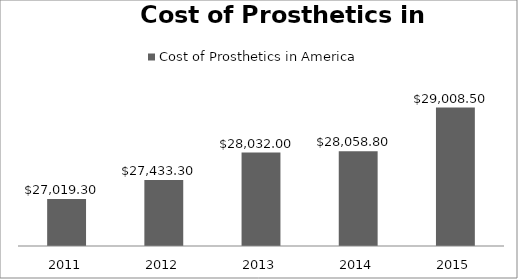
| Category | Cost of Prosthetics in America  |
|---|---|
| 0 | 27019.3 |
| 1 | 27433.3 |
| 2 | 28032 |
| 3 | 28058.8 |
| 4 | 29008.5 |